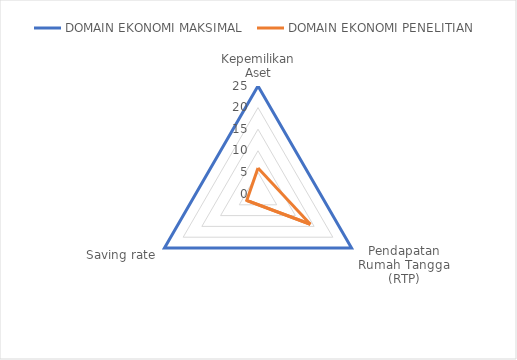
| Category | DOMAIN EKONOMI MAKSIMAL  | DOMAIN EKONOMI PENELITIAN  |
|---|---|---|
| Kepemilikan Aset | 25 | 6 |
| Pendapatan Rumah Tangga (RTP) | 25 | 14 |
| Saving rate | 25 | 3 |